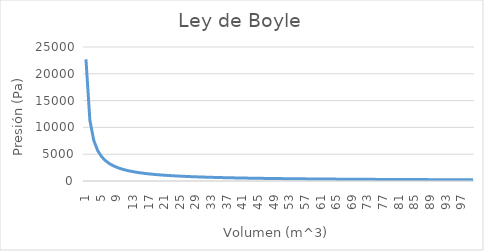
| Category | Series 0 |
|---|---|
| 1.0 | 22697.22 |
| 2.0 | 11348.61 |
| 3.0 | 7565.74 |
| 4.0 | 5674.305 |
| 5.0 | 4539.444 |
| 6.0 | 3782.87 |
| 7.0 | 3242.46 |
| 8.0 | 2837.152 |
| 9.0 | 2521.913 |
| 10.0 | 2269.722 |
| 11.0 | 2063.384 |
| 12.0 | 1891.435 |
| 13.0 | 1745.94 |
| 14.0 | 1621.23 |
| 15.0 | 1513.148 |
| 16.0 | 1418.576 |
| 17.0 | 1335.131 |
| 18.0 | 1260.957 |
| 19.0 | 1194.591 |
| 20.0 | 1134.861 |
| 21.0 | 1080.82 |
| 22.0 | 1031.692 |
| 23.0 | 986.836 |
| 24.0 | 945.718 |
| 25.0 | 907.889 |
| 26.0 | 872.97 |
| 27.0 | 840.638 |
| 28.0 | 810.615 |
| 29.0 | 782.663 |
| 30.0 | 756.574 |
| 31.0 | 732.168 |
| 32.0 | 709.288 |
| 33.0 | 687.795 |
| 34.0 | 667.565 |
| 35.0 | 648.492 |
| 36.0 | 630.478 |
| 37.0 | 613.438 |
| 38.0 | 597.295 |
| 39.0 | 581.98 |
| 40.0 | 567.43 |
| 41.0 | 553.591 |
| 42.0 | 540.41 |
| 43.0 | 527.842 |
| 44.0 | 515.846 |
| 45.0 | 504.383 |
| 46.0 | 493.418 |
| 47.0 | 482.92 |
| 48.0 | 472.859 |
| 49.0 | 463.209 |
| 50.0 | 453.944 |
| 51.0 | 445.044 |
| 52.0 | 436.485 |
| 53.0 | 428.249 |
| 54.0 | 420.319 |
| 55.0 | 412.677 |
| 56.0 | 405.308 |
| 57.0 | 398.197 |
| 58.0 | 391.331 |
| 59.0 | 384.699 |
| 60.0 | 378.287 |
| 61.0 | 372.086 |
| 62.0 | 366.084 |
| 63.0 | 360.273 |
| 64.0 | 354.644 |
| 65.0 | 349.188 |
| 66.0 | 343.897 |
| 67.0 | 338.764 |
| 68.0 | 333.783 |
| 69.0 | 328.945 |
| 70.0 | 324.246 |
| 71.0 | 319.679 |
| 72.0 | 315.239 |
| 73.0 | 310.921 |
| 74.0 | 306.719 |
| 75.0 | 302.63 |
| 76.0 | 298.648 |
| 77.0 | 294.769 |
| 78.0 | 290.99 |
| 79.0 | 287.307 |
| 80.0 | 283.715 |
| 81.0 | 280.213 |
| 82.0 | 276.795 |
| 83.0 | 273.46 |
| 84.0 | 270.205 |
| 85.0 | 267.026 |
| 86.0 | 263.921 |
| 87.0 | 260.888 |
| 88.0 | 257.923 |
| 89.0 | 255.025 |
| 90.0 | 252.191 |
| 91.0 | 249.42 |
| 92.0 | 246.709 |
| 93.0 | 244.056 |
| 94.0 | 241.46 |
| 95.0 | 238.918 |
| 96.0 | 236.429 |
| 97.0 | 233.992 |
| 98.0 | 231.604 |
| 99.0 | 229.265 |
| 100.0 | 226.972 |